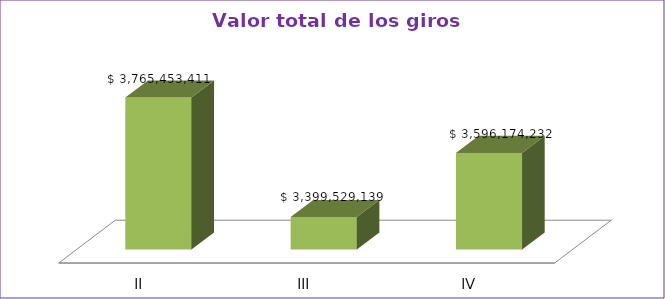
| Category | Series 0 |
|---|---|
| II | 3765453411 |
| III | 3399529139 |
| IV | 3596174232 |